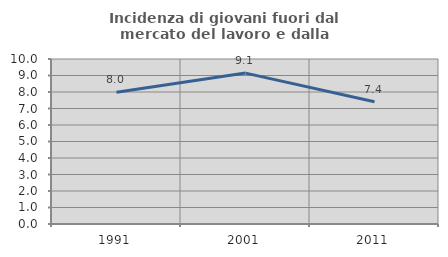
| Category | Incidenza di giovani fuori dal mercato del lavoro e dalla formazione  |
|---|---|
| 1991.0 | 7.988 |
| 2001.0 | 9.145 |
| 2011.0 | 7.414 |